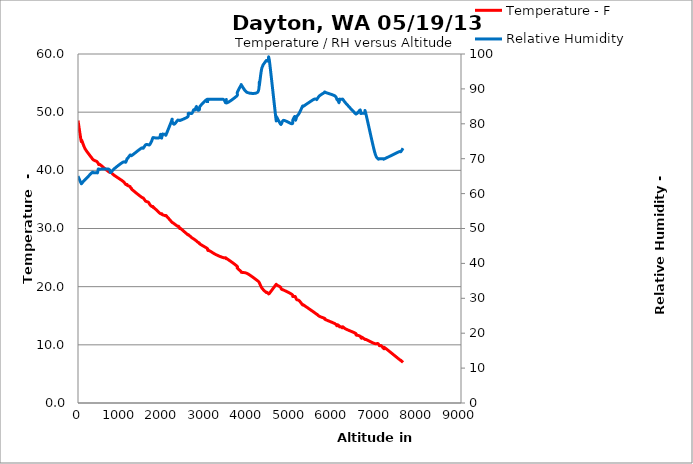
| Category | Temperature - F |
|---|---|
| 0.0 | 48.56 |
| 72.182 | 45.14 |
| 88.587 | 45.14 |
| 167.33100000000002 | 43.7 |
| 328.1 | 42.08 |
| 344.505 | 41.9 |
| 380.596 | 41.72 |
| 436.373 | 41.54 |
| 459.34000000000003 | 41.36 |
| 475.745 | 41.18 |
| 485.588 | 41 |
| 495.43100000000004 | 41 |
| 515.1170000000001 | 41 |
| 725.101 | 39.74 |
| 764.4730000000001 | 39.74 |
| 839.936 | 39.2 |
| 1056.482 | 38.12 |
| 1122.102 | 37.58 |
| 1151.631 | 37.58 |
| 1161.4740000000002 | 37.4 |
| 1220.5320000000002 | 37.22 |
| 1233.656 | 37.04 |
| 1259.904 | 36.86 |
| 1273.028 | 36.68 |
| 1486.2930000000001 | 35.42 |
| 1532.227 | 35.24 |
| 1591.285 | 34.7 |
| 1653.624 | 34.52 |
| 1683.153 | 34.16 |
| 1729.087 | 33.8 |
| 1758.616 | 33.8 |
| 1768.459 | 33.62 |
| 1778.3020000000001 | 33.62 |
| 1909.5420000000001 | 32.72 |
| 1939.0710000000001 | 32.54 |
| 1965.3190000000002 | 32.54 |
| 1965.3190000000002 | 32.54 |
| 1988.286 | 32.36 |
| 1988.286 | 32.36 |
| 1988.286 | 32.36 |
| 1988.286 | 32.36 |
| 2060.4680000000003 | 32.18 |
| 2073.592 | 32.18 |
| 2204.832 | 31.1 |
| 2204.832 | 31.1 |
| 2240.9230000000002 | 30.92 |
| 2273.733 | 30.74 |
| 2339.353 | 30.38 |
| 2349.196 | 30.38 |
| 2365.601 | 30.38 |
| 2378.725 | 30.2 |
| 2388.568 | 30.02 |
| 2398.411 | 30.02 |
| 2408.254 | 30.02 |
| 2578.866 | 28.94 |
| 2591.9900000000002 | 28.94 |
| 2677.2960000000003 | 28.4 |
| 2716.668 | 28.22 |
| 2749.478 | 28.04 |
| 2782.288 | 27.86 |
| 2808.536 | 27.68 |
| 2851.1890000000003 | 27.5 |
| 2867.594 | 27.32 |
| 3031.6440000000002 | 26.6 |
| 3041.487 | 26.42 |
| 3051.33 | 26.24 |
| 3057.8920000000003 | 26.24 |
| 3067.735 | 26.24 |
| 3116.9500000000003 | 26.06 |
| 3238.347 | 25.52 |
| 3415.521 | 24.98 |
| 3468.0170000000003 | 24.98 |
| 3484.422 | 24.8 |
| 3500.827 | 24.8 |
| 3733.7780000000002 | 23.54 |
| 3743.621 | 23.18 |
| 3828.927 | 22.64 |
| 3845.3320000000003 | 22.46 |
| 3973.291 | 22.28 |
| 4219.366 | 21.02 |
| 4262.019 | 20.66 |
| 4262.019 | 20.66 |
| 4321.077 | 19.76 |
| 4416.226000000001 | 19.04 |
| 4432.631 | 19.04 |
| 4472.003000000001 | 18.86 |
| 4498.251 | 18.86 |
| 4645.896000000001 | 20.3 |
| 4652.4580000000005 | 20.3 |
| 4665.582 | 20.3 |
| 4754.169 | 19.94 |
| 4780.417 | 19.58 |
| 4836.194 | 19.4 |
| 5026.492 | 18.68 |
| 5046.178 | 18.32 |
| 5085.55 | 18.32 |
| 5101.955 | 18.32 |
| 5115.079000000001 | 18.14 |
| 5138.046 | 17.78 |
| 5197.104 | 17.6 |
| 5275.848 | 16.88 |
| 5292.253000000001 | 16.88 |
| 5541.609 | 15.62 |
| 5607.229 | 15.26 |
| 5613.791 | 15.26 |
| 5672.849 | 14.9 |
| 5797.527 | 14.54 |
| 5810.651 | 14.36 |
| 6037.04 | 13.64 |
| 6082.974 | 13.28 |
| 6099.379 | 13.46 |
| 6132.189 | 13.28 |
| 6148.594 | 13.1 |
| 6148.594 | 13.1 |
| 6178.1230000000005 | 13.1 |
| 6210.933 | 12.92 |
| 6224.057000000001 | 13.1 |
| 6286.396000000001 | 12.74 |
| 6512.785 | 12.02 |
| 6525.909000000001 | 11.84 |
| 6542.314 | 11.66 |
| 6562.0 | 11.66 |
| 6630.901 | 11.48 |
| 6644.025000000001 | 11.3 |
| 6660.43 | 11.12 |
| 6673.554 | 11.3 |
| 6742.455 | 10.94 |
| 6762.1410000000005 | 10.94 |
| 6968.844 | 10.22 |
| 7047.588000000001 | 10.22 |
| 7083.679 | 9.86 |
| 7126.332 | 9.86 |
| 7165.704000000001 | 9.5 |
| 7191.952 | 9.32 |
| 7208.357 | 9.5 |
| 7546.3 | 7.52 |
| 7585.6720000000005 | 7.34 |
| 7638.168000000001 | 6.98 |